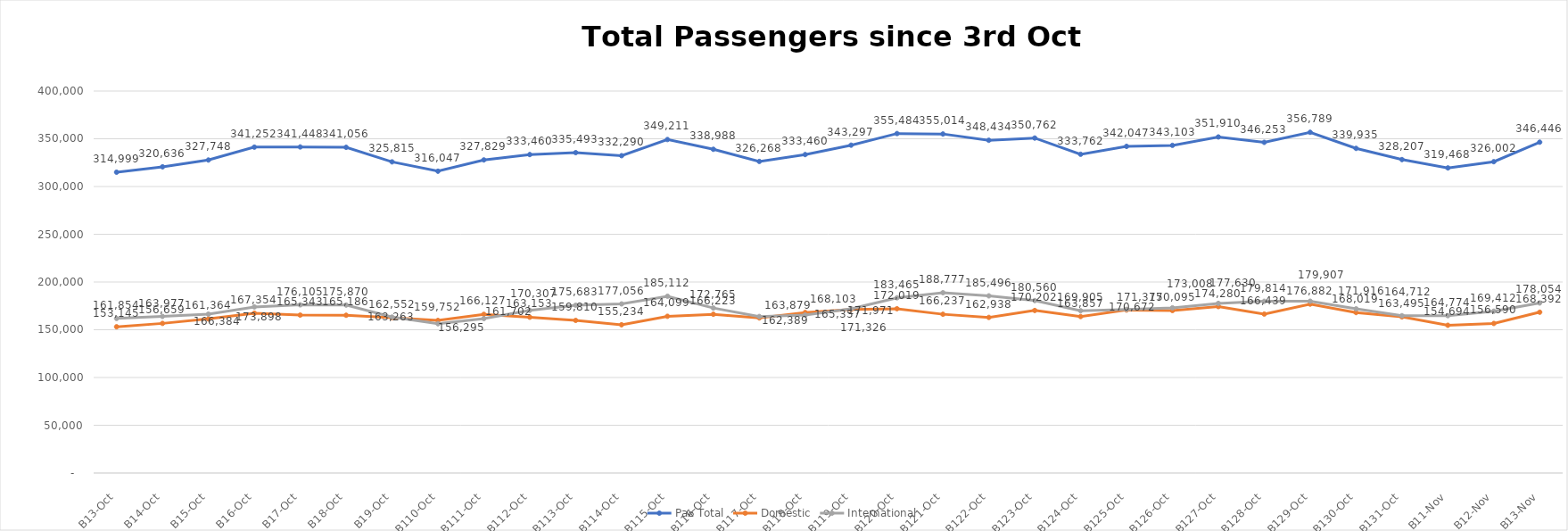
| Category | Pax Total | Domestic | International |
|---|---|---|---|
| 2023-10-03 | 314999 | 153145 | 161854 |
| 2023-10-04 | 320636 | 156659 | 163977 |
| 2023-10-05 | 327748 | 161364 | 166384 |
| 2023-10-06 | 341252 | 167354 | 173898 |
| 2023-10-07 | 341448 | 165343 | 176105 |
| 2023-10-08 | 341056 | 165186 | 175870 |
| 2023-10-09 | 325815 | 162552 | 163263 |
| 2023-10-10 | 316047 | 159752 | 156295 |
| 2023-10-11 | 327829 | 166127 | 161702 |
| 2023-10-12 | 333460 | 163153 | 170307 |
| 2023-10-13 | 335493 | 159810 | 175683 |
| 2023-10-14 | 332290 | 155234 | 177056 |
| 2023-10-15 | 349211 | 164099 | 185112 |
| 2023-10-16 | 338988 | 166223 | 172765 |
| 2023-10-17 | 326268 | 162389 | 163879 |
| 2023-10-18 | 333460 | 168103 | 165357 |
| 2023-10-19 | 343297 | 171326 | 171971 |
| 2023-10-20 | 355484 | 172019 | 183465 |
| 2023-10-21 | 355014 | 166237 | 188777 |
| 2023-10-22 | 348434 | 162938 | 185496 |
| 2023-10-23 | 350762 | 170202 | 180560 |
| 2023-10-24 | 333762 | 163857 | 169905 |
| 2023-10-25 | 342047 | 170672 | 171375 |
| 2023-10-26 | 343103 | 170095 | 173008 |
| 2023-10-27 | 351910 | 174280 | 177630 |
| 2023-10-28 | 346253 | 166439 | 179814 |
| 2023-10-29 | 356789 | 176882 | 179907 |
| 2023-10-30 | 339935 | 168019 | 171916 |
| 2023-10-31 | 328207 | 163495 | 164712 |
| 2023-11-01 | 319468 | 154694 | 164774 |
| 2023-11-02 | 326002 | 156590 | 169412 |
| 2023-11-03 | 346446 | 168392 | 178054 |